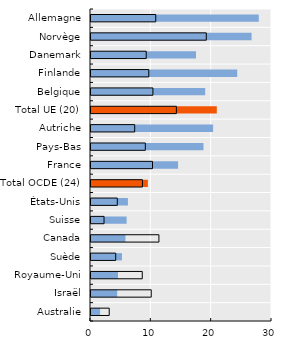
| Category | Nés dans le pays de deux parents immigrés | Nés dans le pays de deux parents nés dans le pays |
|---|---|---|
| Australie | 1.512 | 3.019 |
| Israël | 4.347 | 9.982 |
| Royaume-Uni | 4.48 | 8.495 |
| Suède | 5.128 | 4.093 |
| Canada | 5.709 | 11.257 |
| Suisse | 5.903 | 2.161 |
| États-Unis | 6.12 | 4.357 |
| Total OCDE (24) | 9.428 | 8.525 |
| France | 14.431 | 10.192 |
| Pays-Bas | 18.644 | 9.003 |
| Autriche | 20.241 | 7.243 |
| Total UE (20) | 20.849 | 14.152 |
| Belgique | 18.923 | 10.263 |
| Finlande | 24.234 | 9.577 |
| Danemark | 17.401 | 9.154 |
| Norvège | 26.614 | 19.11 |
| Allemagne | 27.807 | 10.732 |